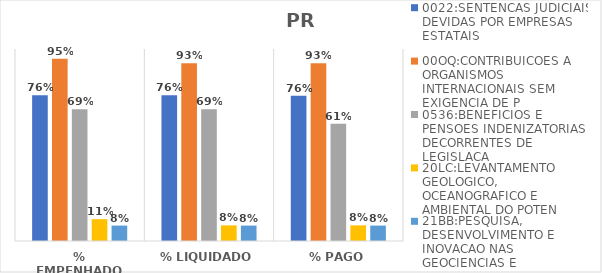
| Category | 0022:SENTENCAS JUDICIAIS DEVIDAS POR EMPRESAS ESTATAIS | 00OQ:CONTRIBUICOES A ORGANISMOS INTERNACIONAIS SEM EXIGENCIA DE P | 0536:BENEFICIOS E PENSOES INDENIZATORIAS DECORRENTES DE LEGISLACA | 20LC:LEVANTAMENTO GEOLOGICO, OCEANOGRAFICO E AMBIENTAL DO POTEN | 21BB:PESQUISA, DESENVOLVIMENTO E INOVACAO NAS GEOCIENCIAS E |
|---|---|---|---|---|---|
| % EMPENHADO | 0.759 | 0.95 | 0.687 | 0.114 | 0.08 |
| % LIQUIDADO | 0.759 | 0.926 | 0.687 | 0.081 | 0.08 |
| % PAGO | 0.756 | 0.926 | 0.611 | 0.081 | 0.08 |